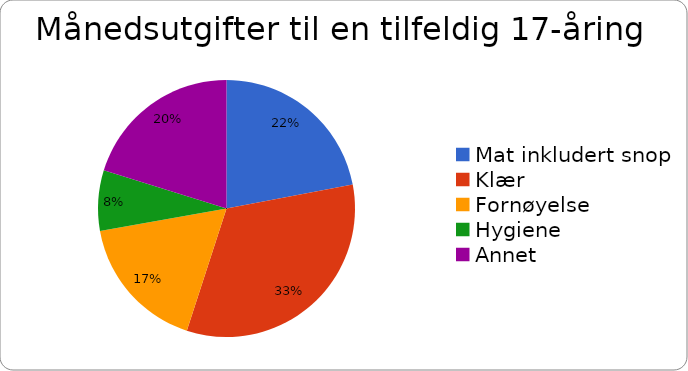
| Category | Prosent |
|---|---|
| Mat inkludert snop | 22 |
| Klær | 33 |
| Fornøyelse | 17.2 |
| Hygiene | 7.6 |
| Annet | 20.2 |